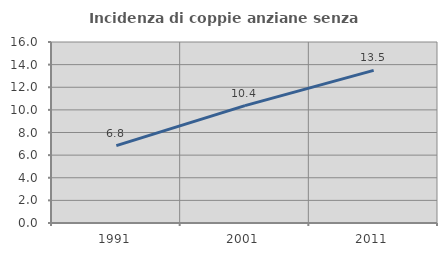
| Category | Incidenza di coppie anziane senza figli  |
|---|---|
| 1991.0 | 6.841 |
| 2001.0 | 10.377 |
| 2011.0 | 13.492 |